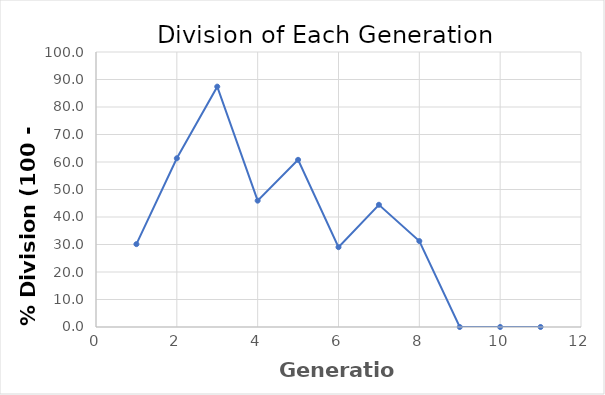
| Category | Series 0 |
|---|---|
| 1.0 | 30.131 |
| 2.0 | 61.353 |
| 3.0 | 87.402 |
| 4.0 | 45.946 |
| 5.0 | 60.784 |
| 6.0 | 29.032 |
| 7.0 | 44.444 |
| 8.0 | 31.25 |
| 9.0 | 0 |
| 10.0 | 0 |
| 11.0 | 0 |